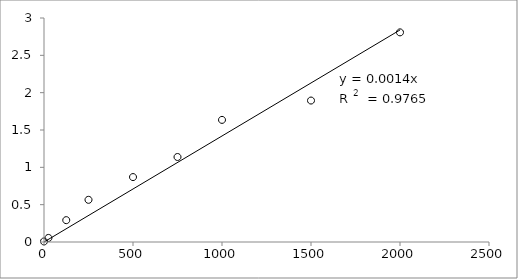
| Category | Series 0 |
|---|---|
| 2000.0 | 2.808 |
| 1500.0 | 1.894 |
| 1000.0 | 1.636 |
| 750.0 | 1.138 |
| 500.0 | 0.869 |
| 250.0 | 0.565 |
| 125.0 | 0.292 |
| 25.0 | 0.054 |
| 0.0 | 0.008 |